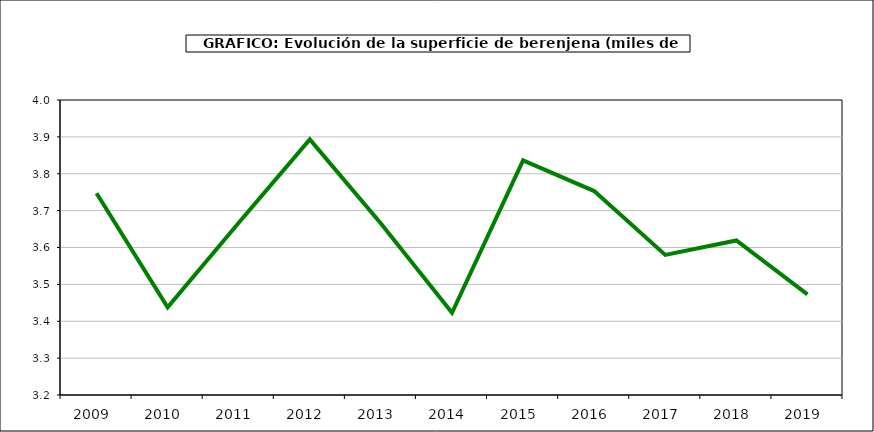
| Category | superficie |
|---|---|
| 2009.0 | 3.747 |
| 2010.0 | 3.438 |
| 2011.0 | 3.667 |
| 2012.0 | 3.893 |
| 2013.0 | 3.665 |
| 2014.0 | 3.423 |
| 2015.0 | 3.836 |
| 2016.0 | 3.753 |
| 2017.0 | 3.58 |
| 2018.0 | 3.619 |
| 2019.0 | 3.473 |